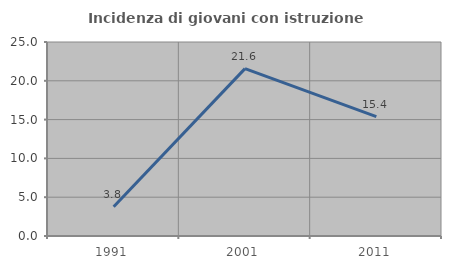
| Category | Incidenza di giovani con istruzione universitaria |
|---|---|
| 1991.0 | 3.774 |
| 2001.0 | 21.569 |
| 2011.0 | 15.385 |